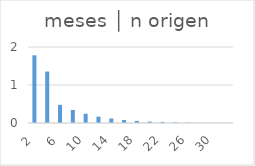
| Category | meses │ n origen |
|---|---|
| 2.0 | 1.781 |
| 4.0 | 1.353 |
| 6.0 | 0.478 |
| 8.0 | 0.345 |
| 10.0 | 0.244 |
| 12.0 | 0.167 |
| 14.0 | 0.117 |
| 16.0 | 0.08 |
| 18.0 | 0.055 |
| 20.0 | 0.037 |
| 22.0 | 0.028 |
| 24.0 | 0.017 |
| 26.0 | 0.008 |
| 28.0 | 0.004 |
| 30.0 | 0 |
| 32.0 | 0 |